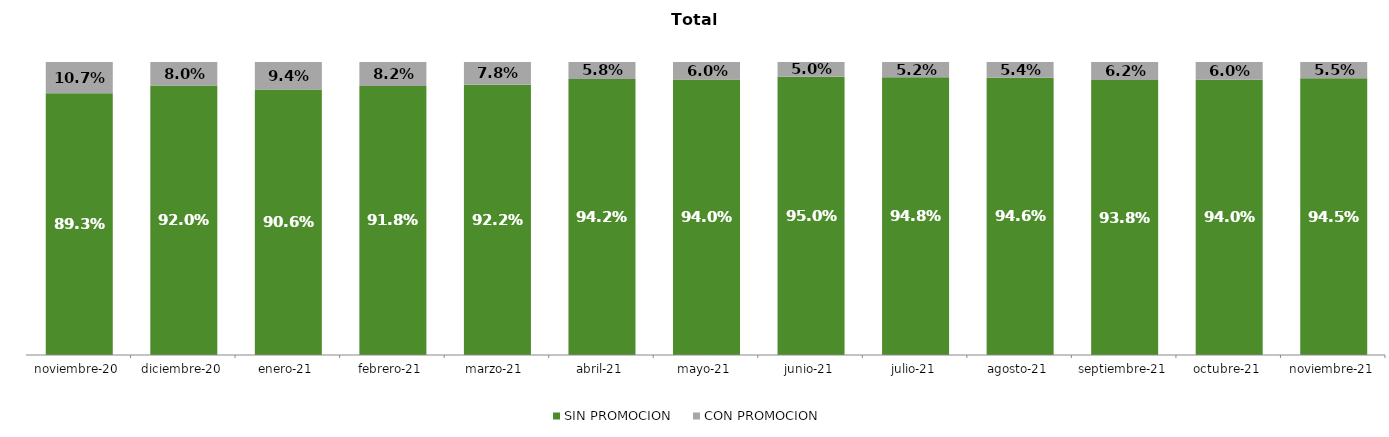
| Category | SIN PROMOCION   | CON PROMOCION   |
|---|---|---|
| 2020-11-01 | 0.893 | 0.107 |
| 2020-12-01 | 0.92 | 0.08 |
| 2021-01-01 | 0.906 | 0.094 |
| 2021-02-01 | 0.918 | 0.082 |
| 2021-03-01 | 0.922 | 0.078 |
| 2021-04-01 | 0.942 | 0.058 |
| 2021-05-01 | 0.94 | 0.06 |
| 2021-06-01 | 0.95 | 0.05 |
| 2021-07-01 | 0.948 | 0.052 |
| 2021-08-01 | 0.946 | 0.054 |
| 2021-09-01 | 0.938 | 0.062 |
| 2021-10-01 | 0.94 | 0.06 |
| 2021-11-01 | 0.945 | 0.055 |